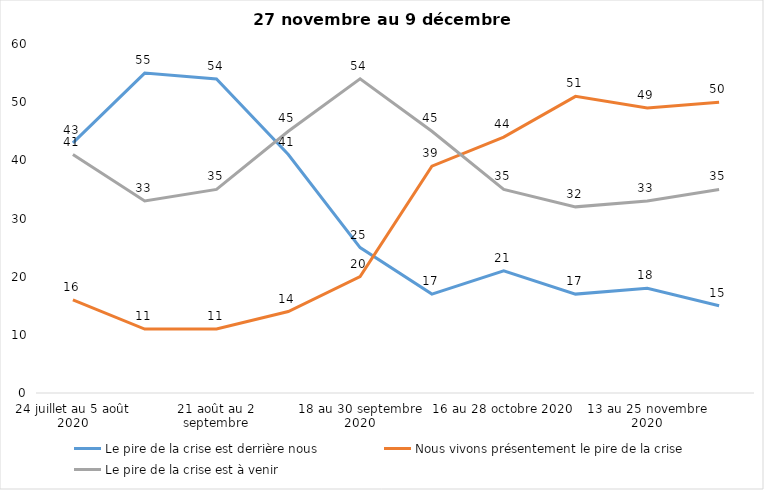
| Category | Le pire de la crise est derrière nous | Nous vivons présentement le pire de la crise | Le pire de la crise est à venir |
|---|---|---|---|
| 24 juillet au 5 août 2020 | 43 | 16 | 41 |
| 7 au 19 août 2020 | 55 | 11 | 33 |
| 21 août au 2 septembre | 54 | 11 | 35 |
| 4 au 16 septembre 2020 | 41 | 14 | 45 |
| 18 au 30 septembre 2020 | 25 | 20 | 54 |
| 2 au 14 octobre 2020 | 17 | 39 | 45 |
| 16 au 28 octobre 2020 | 21 | 44 | 35 |
| 30 octobre au 11 novembre 2020 | 17 | 51 | 32 |
| 13 au 25 novembre 2020 | 18 | 49 | 33 |
| 27 au 9 décembre 2020 | 15 | 50 | 35 |